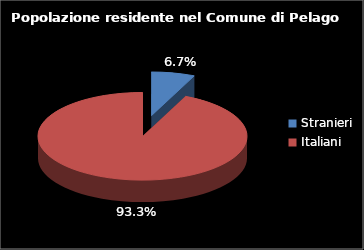
| Category | Series 0 |
|---|---|
| Stranieri | 519 |
| Italiani | 7190 |